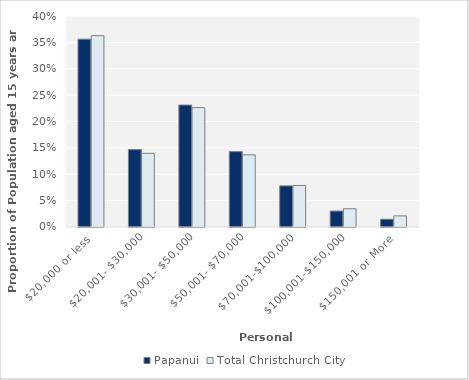
| Category | Papanui | Total Christchurch City |
|---|---|---|
| $20,000 or less | 0.356 | 0.363 |
| $20,001- $30,000 | 0.147 | 0.14 |
| $30,001- $50,000 | 0.231 | 0.226 |
| $50,001- $70,000 | 0.143 | 0.137 |
| $70,001-$100,000 | 0.078 | 0.079 |
| $100,001-$150,000 | 0.03 | 0.035 |
| $150,001 or More | 0.015 | 0.021 |